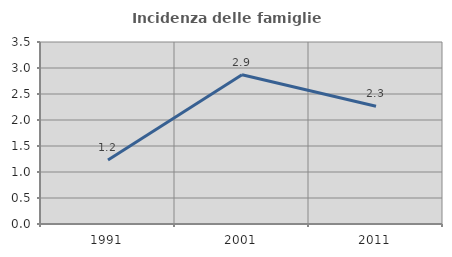
| Category | Incidenza delle famiglie numerose |
|---|---|
| 1991.0 | 1.231 |
| 2001.0 | 2.87 |
| 2011.0 | 2.266 |